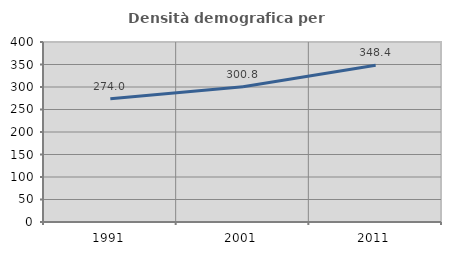
| Category | Densità demografica |
|---|---|
| 1991.0 | 273.983 |
| 2001.0 | 300.784 |
| 2011.0 | 348.409 |